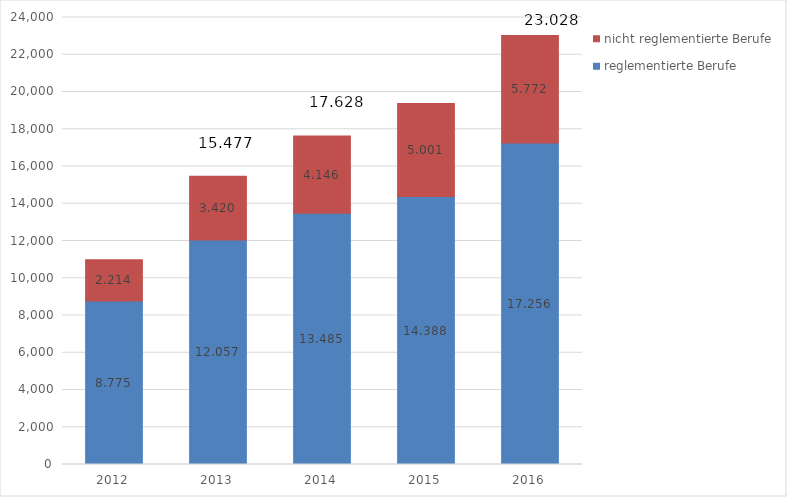
| Category | reglementierte Berufe | nicht reglementierte Berufe |
|---|---|---|
| 2012.0 | 8775 | 2214 |
| 2013.0 | 12057 | 3420 |
| 2014.0 | 13485 | 4146 |
| 2015.0 | 14388 | 5001 |
| 2016.0 | 17256 | 5772 |